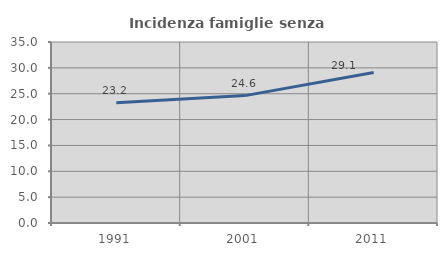
| Category | Incidenza famiglie senza nuclei |
|---|---|
| 1991.0 | 23.24 |
| 2001.0 | 24.633 |
| 2011.0 | 29.102 |